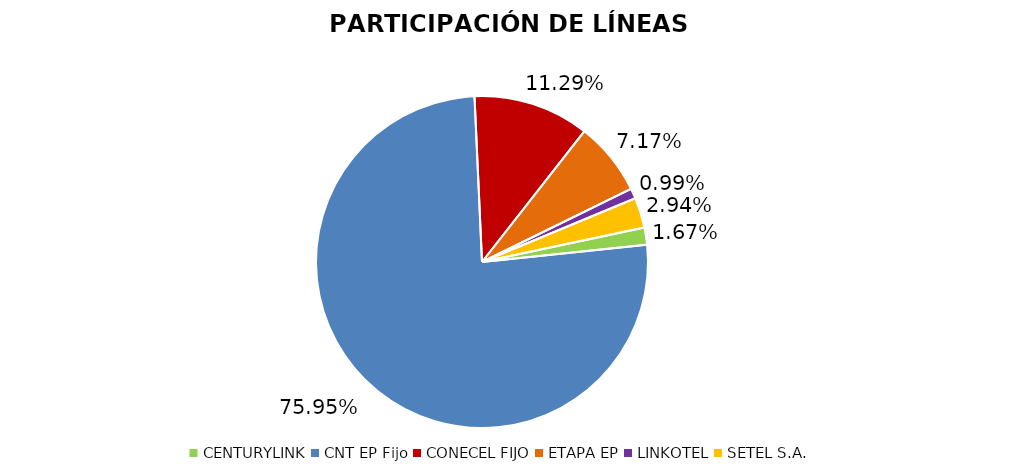
| Category | Participación en el Mercado |
|---|---|
| CENTURYLINK | 0.017 |
| CNT EP Fijo | 0.759 |
| CONECEL FIJO | 0.113 |
| ETAPA EP | 0.072 |
| LINKOTEL | 0.01 |
| SETEL S.A. | 0.029 |